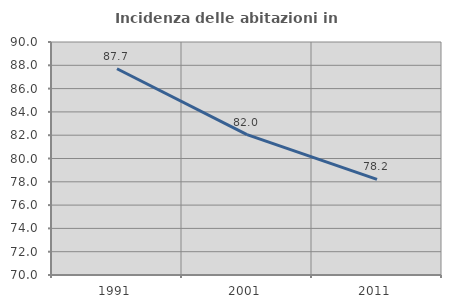
| Category | Incidenza delle abitazioni in proprietà  |
|---|---|
| 1991.0 | 87.705 |
| 2001.0 | 82.045 |
| 2011.0 | 78.202 |